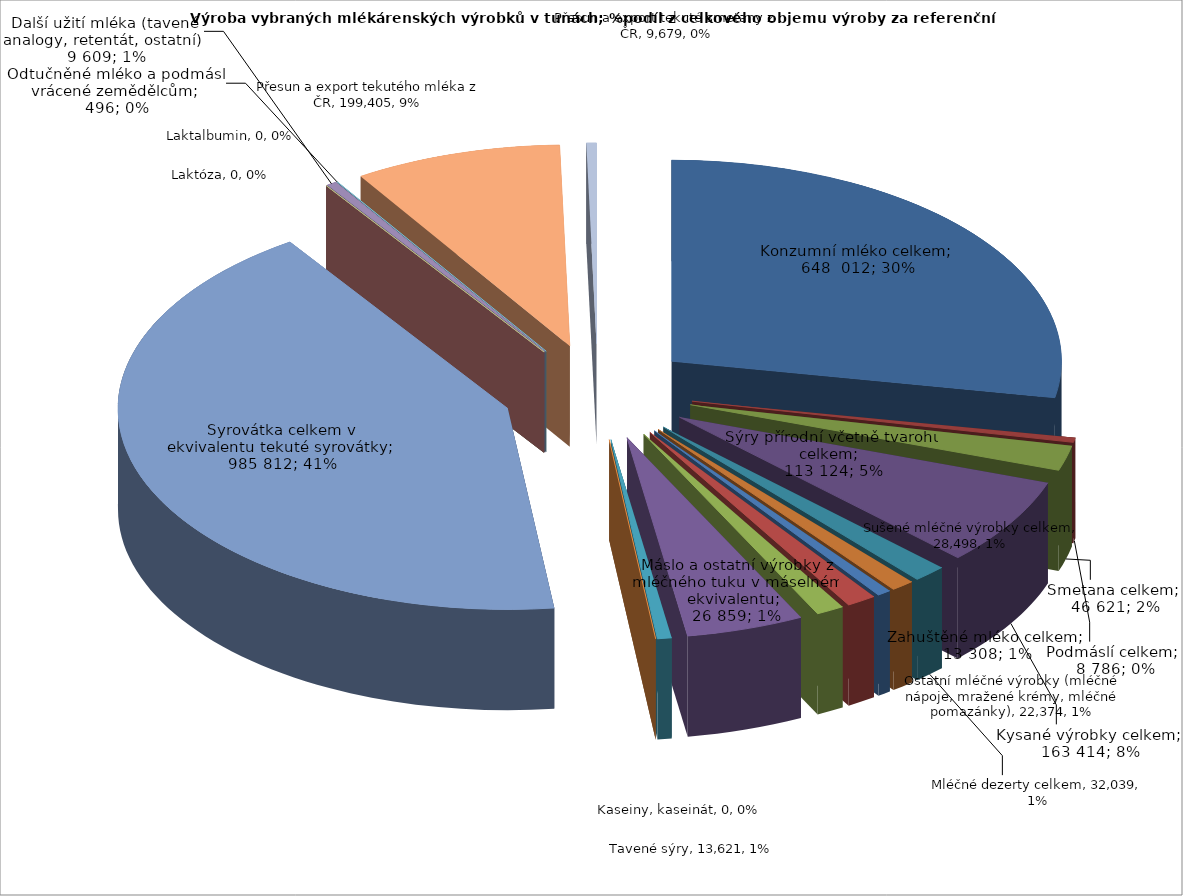
| Category | Množství výrobku v tunách |
|---|---|
| Konzumní mléko celkem | 648012 |
| Podmáslí celkem | 8786 |
| Smetana celkem | 46621 |
| Kysané výrobky celkem | 163414 |
| Mléčné dezerty celkem | 32039 |
| Ostatní mléčné výrobky (mléčné nápoje, mražené krémy, mléčné pomazánky) | 22374 |
| Zahuštěné mléko celkem | 13308 |
| Sušené mléčné výrobky celkem | 28498 |
| Máslo a  ostatní výrobky z mléčného tuku v máselném ekvivalentu | 26859 |
| Sýry přírodní včetně tvarohu celkem | 113124 |
| Tavené sýry | 13621 |
| Kaseiny, kaseinát | 0 |
| Syrovátka celkem v ekvivalentu tekuté syrovátky | 985812 |
| Laktóza | 0 |
| Laktalbumin | 0 |
| Další užití mléka (tavené analogy, retentát, ostatní) | 9609 |
| Odtučněné mléko a podmáslí vrácené zemědělcům | 496 |
| Přesun a export tekutého mléka z ČR | 199405 |
| Přesun a export tekuté smetany z ČR | 9679 |